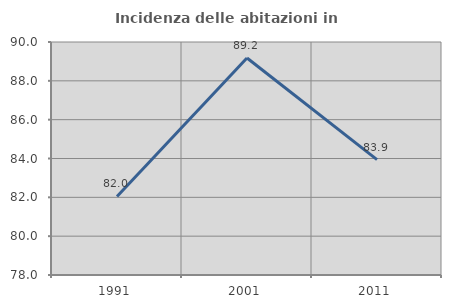
| Category | Incidenza delle abitazioni in proprietà  |
|---|---|
| 1991.0 | 82.046 |
| 2001.0 | 89.177 |
| 2011.0 | 83.945 |